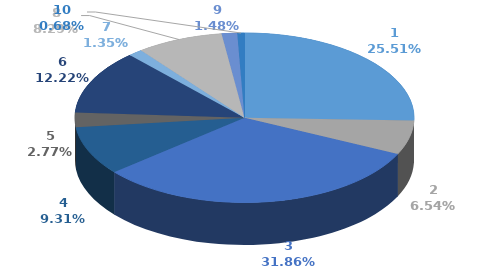
| Category | Series 0 |
|---|---|
| 0 | 374826 |
| 1 | 96087 |
| 2 | 468115 |
| 3 | 136811 |
| 4 | 40660 |
| 5 | 179514 |
| 6 | 19790 |
| 7 | 121797 |
| 8 | 21700 |
| 9 | 10000 |